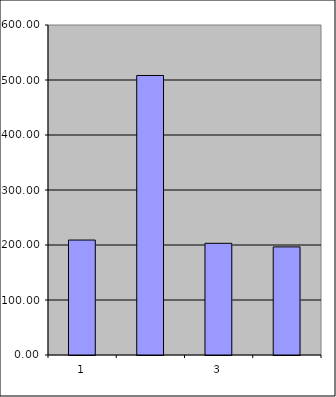
| Category | Series 0 |
|---|---|
| 0 | 209 |
| 1 | 508.194 |
| 2 | 203.066 |
| 3 | 196.576 |